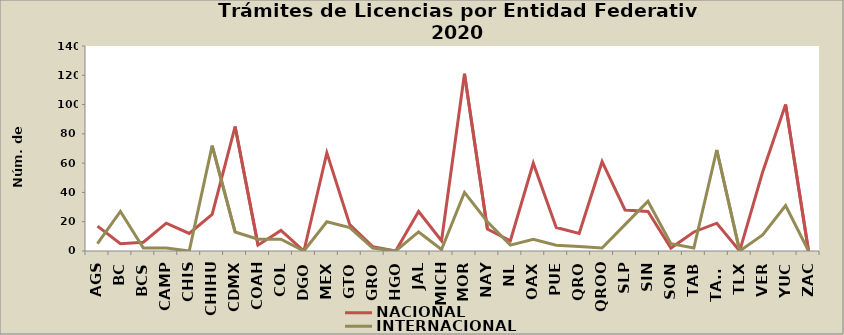
| Category | NACIONAL | INTERNACIONAL |
|---|---|---|
| AGS | 17 | 5 |
| BC | 5 | 27 |
| BCS | 6 | 2 |
| CAMP | 19 | 2 |
| CHIS | 12 | 0 |
| CHIHU | 25 | 72 |
| CDMX | 85 | 13 |
| COAH | 4 | 8 |
| COL | 14 | 8 |
| DGO | 0 | 0 |
| MEX | 67 | 20 |
| GTO | 18 | 16 |
| GRO | 3 | 2 |
| HGO | 0 | 0 |
| JAL | 27 | 13 |
| MICH | 7 | 1 |
| MOR | 121 | 40 |
| NAY | 15 | 20 |
| NL | 7 | 4 |
| OAX | 60 | 8 |
| PUE | 16 | 4 |
| QRO | 12 | 3 |
| QROO | 61 | 2 |
| SLP | 28 | 18 |
| SIN | 27 | 34 |
| SON | 2 | 5 |
| TAB | 13 | 2 |
| TAMS | 19 | 69 |
| TLX | 0 | 0 |
| VER | 54 | 11 |
| YUC | 100 | 31 |
| ZAC | 0 | 0 |